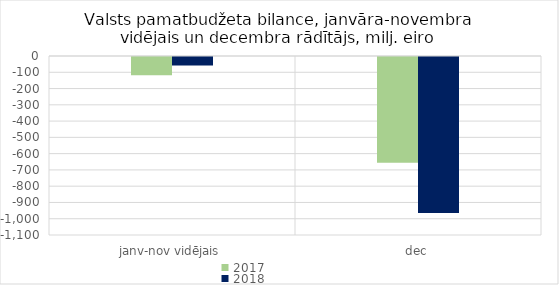
| Category | 2017 | 2018 |
|---|---|---|
| janv-nov vidējais | -112720.799 | -52040.023 |
| dec | -649319.296 | -958560.445 |